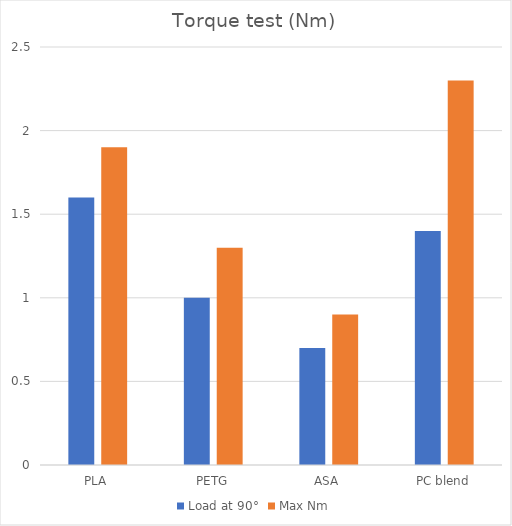
| Category | Load at 90° | Max Nm |
|---|---|---|
| PLA | 1.6 | 1.9 |
| PETG | 1 | 1.3 |
| ASA | 0.7 | 0.9 |
| PC blend | 1.4 | 2.3 |